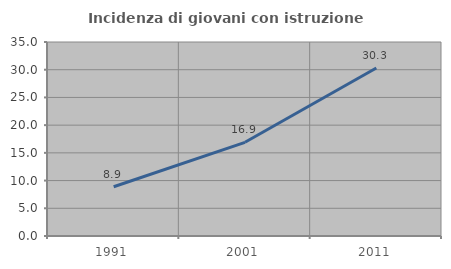
| Category | Incidenza di giovani con istruzione universitaria |
|---|---|
| 1991.0 | 8.889 |
| 2001.0 | 16.901 |
| 2011.0 | 30.303 |